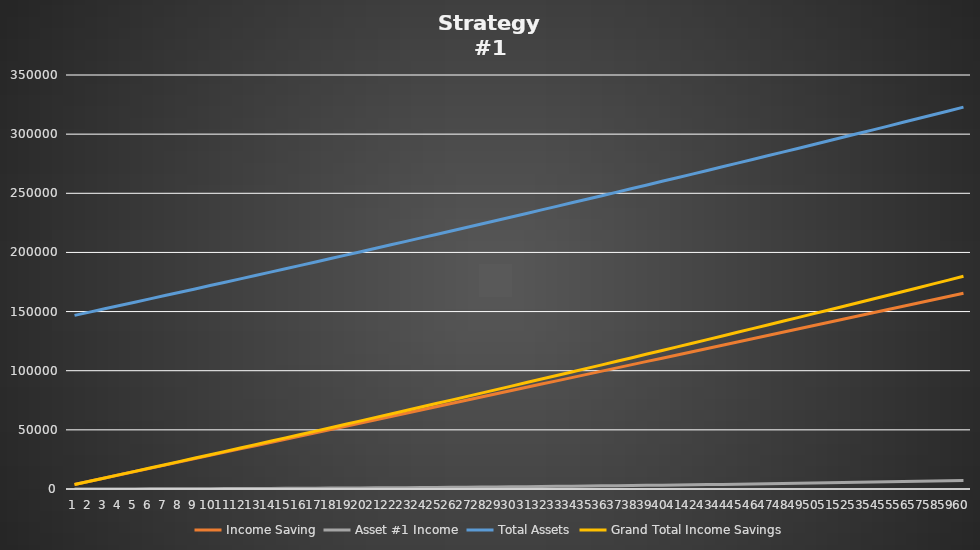
| Category | Income Saving | Asset #1 Income | Total Assets | Grand Total Income Savings |
|---|---|---|---|---|
| 0 | 3758.819 | 13.271 | 146785.361 | 3785.361 |
| 1 | 6498.707 | 29.797 | 149558.301 | 6558.301 |
| 2 | 9238.594 | 49.596 | 152337.786 | 9337.786 |
| 3 | 11978.481 | 72.685 | 155123.852 | 12123.852 |
| 4 | 14718.369 | 99.082 | 157916.532 | 14916.532 |
| 5 | 17458.256 | 128.804 | 160715.863 | 17715.863 |
| 6 | 20198.143 | 161.868 | 163521.88 | 20521.88 |
| 7 | 22938.03 | 198.293 | 166334.617 | 23334.617 |
| 8 | 25677.918 | 238.097 | 169154.111 | 26154.111 |
| 9 | 28417.805 | 281.297 | 171980.398 | 28980.398 |
| 10 | 31157.692 | 327.911 | 174813.514 | 31813.514 |
| 11 | 33897.58 | 377.957 | 177653.494 | 34653.494 |
| 12 | 36637.467 | 431.454 | 180500.376 | 37500.376 |
| 13 | 39377.354 | 488.42 | 183354.195 | 40354.195 |
| 14 | 42117.242 | 548.874 | 186214.989 | 43214.989 |
| 15 | 44857.129 | 612.833 | 189082.796 | 46082.796 |
| 16 | 47597.016 | 680.317 | 191957.651 | 48957.651 |
| 17 | 50336.904 | 751.344 | 194839.593 | 51839.593 |
| 18 | 53076.791 | 825.934 | 197728.658 | 54728.658 |
| 19 | 55816.678 | 904.104 | 200624.886 | 57624.886 |
| 20 | 58556.566 | 985.874 | 203528.314 | 60528.314 |
| 21 | 61296.453 | 1071.263 | 206438.979 | 63438.979 |
| 22 | 64036.34 | 1160.291 | 209356.921 | 66356.921 |
| 23 | 66776.228 | 1252.976 | 212282.179 | 69282.179 |
| 24 | 69516.115 | 1349.338 | 215214.79 | 72214.79 |
| 25 | 72256.002 | 1449.396 | 218154.795 | 75154.795 |
| 26 | 74995.89 | 1553.171 | 221102.231 | 78102.231 |
| 27 | 77735.777 | 1660.682 | 224057.14 | 81057.14 |
| 28 | 80475.664 | 1771.948 | 227019.56 | 84019.56 |
| 29 | 83215.552 | 1886.99 | 229989.531 | 86989.531 |
| 30 | 85955.439 | 2005.827 | 232967.094 | 89967.094 |
| 31 | 88695.326 | 2128.481 | 235952.288 | 92952.288 |
| 32 | 91435.213 | 2254.97 | 238945.154 | 95945.154 |
| 33 | 94175.101 | 2385.316 | 241945.733 | 98945.733 |
| 34 | 96914.988 | 2519.539 | 244954.066 | 101954.066 |
| 35 | 99654.875 | 2657.66 | 247970.195 | 104970.195 |
| 36 | 102394.763 | 2799.698 | 250994.159 | 107994.159 |
| 37 | 105134.65 | 2945.676 | 254026.001 | 111026.001 |
| 38 | 107874.537 | 3095.613 | 257065.764 | 114065.764 |
| 39 | 110614.425 | 3249.532 | 260113.488 | 117113.488 |
| 40 | 113354.312 | 3407.452 | 263169.216 | 120169.216 |
| 41 | 116094.199 | 3569.396 | 266232.991 | 123232.991 |
| 42 | 118834.087 | 3735.384 | 269304.855 | 126304.855 |
| 43 | 121573.974 | 3905.439 | 272384.851 | 129384.851 |
| 44 | 124313.861 | 4079.581 | 275473.023 | 132473.023 |
| 45 | 127053.749 | 4257.832 | 278569.413 | 135569.413 |
| 46 | 129793.636 | 4440.215 | 281674.066 | 138674.066 |
| 47 | 132533.523 | 4626.751 | 284787.026 | 141787.026 |
| 48 | 135273.411 | 4817.462 | 287908.335 | 144908.335 |
| 49 | 138013.298 | 5012.371 | 291038.04 | 148038.04 |
| 50 | 140753.185 | 5211.499 | 294176.183 | 151176.183 |
| 51 | 143493.073 | 5414.869 | 297322.811 | 154322.811 |
| 52 | 146232.96 | 5622.504 | 300477.968 | 157477.968 |
| 53 | 148972.847 | 5834.426 | 303641.699 | 160641.699 |
| 54 | 151712.735 | 6050.658 | 306814.05 | 163814.05 |
| 55 | 154452.622 | 6271.223 | 309995.067 | 166995.067 |
| 56 | 157192.509 | 6496.143 | 313184.796 | 170184.796 |
| 57 | 159932.396 | 6725.443 | 316383.282 | 173383.282 |
| 58 | 162672.284 | 6959.144 | 319590.573 | 176590.573 |
| 59 | 165412.171 | 7197.272 | 322806.715 | 179806.715 |